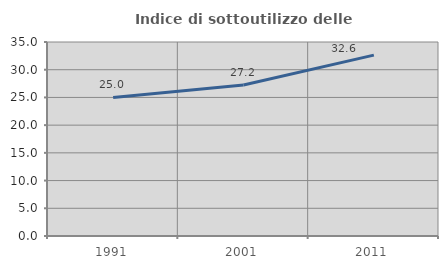
| Category | Indice di sottoutilizzo delle abitazioni  |
|---|---|
| 1991.0 | 25 |
| 2001.0 | 27.24 |
| 2011.0 | 32.639 |